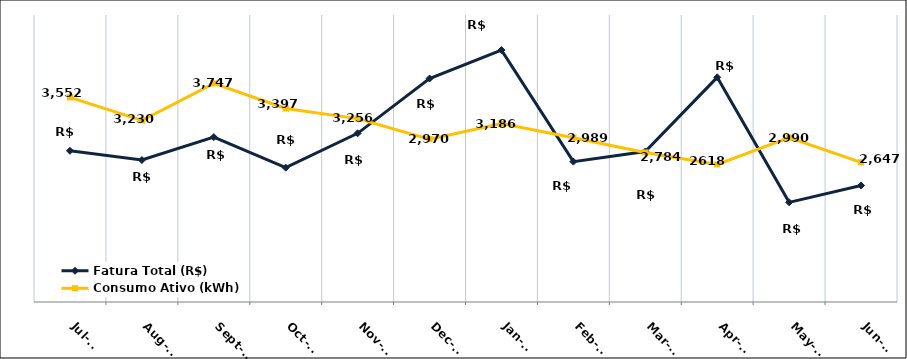
| Category | Fatura Total (R$) |
|---|---|
| 2023-07-01 | 2807.62 |
| 2023-08-01 | 2678.44 |
| 2023-09-01 | 2998.48 |
| 2023-10-01 | 2572.38 |
| 2023-11-01 | 3050.77 |
| 2023-12-01 | 3814.56 |
| 2024-01-01 | 4211.19 |
| 2024-02-01 | 2656.49 |
| 2024-03-01 | 2797.24 |
| 2024-04-01 | 3831.15 |
| 2024-05-01 | 2088.89 |
| 2024-06-01 | 2323.55 |